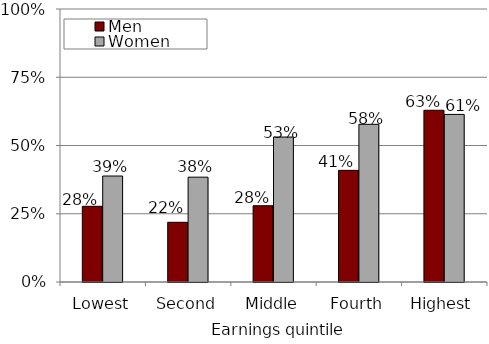
| Category | Men | Women |
|---|---|---|
| Lowest | 0.277 | 0.388 |
| Second | 0.219 | 0.384 |
| Middle | 0.279 | 0.531 |
| Fourth | 0.409 | 0.578 |
| Highest | 0.629 | 0.614 |